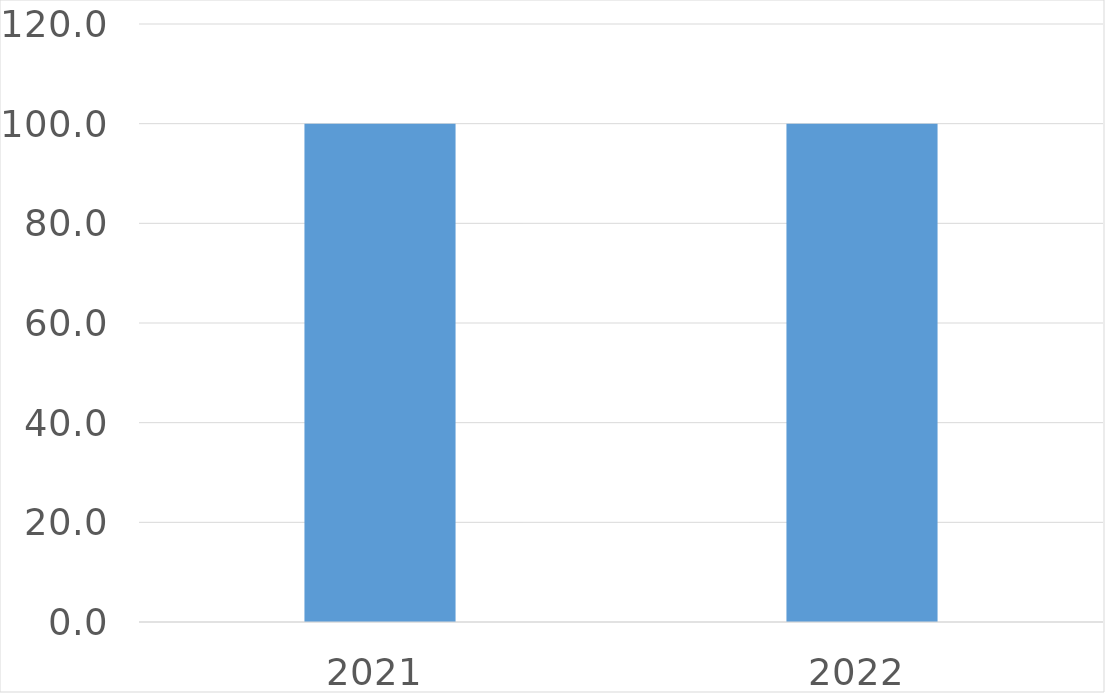
| Category | Series 0 |
|---|---|
| 2021 | 100 |
| 2022 | 100 |